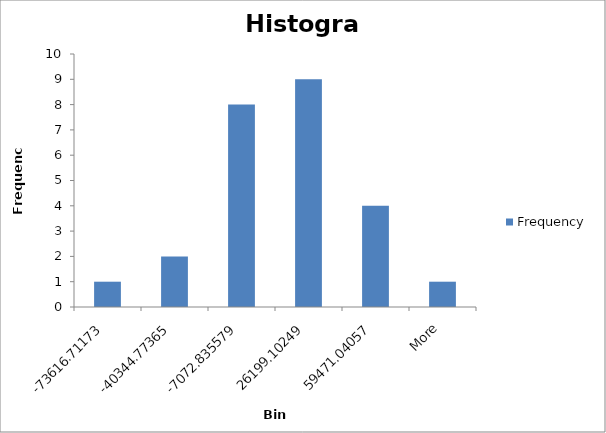
| Category | Frequency |
|---|---|
| -73616.71173 | 1 |
| -40344.77365 | 2 |
| -7072.835579 | 8 |
| 26199.10249 | 9 |
| 59471.04057 | 4 |
| More | 1 |